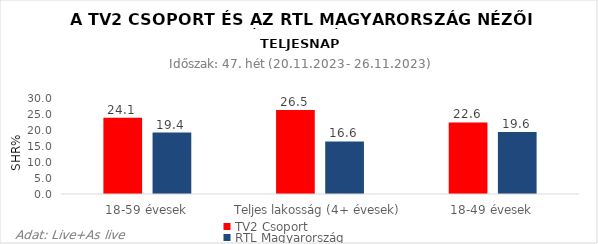
| Category | TV2 Csoport | RTL Magyarország |
|---|---|---|
| 18-59 évesek | 24.1 | 19.4 |
| Teljes lakosság (4+ évesek) | 26.5 | 16.6 |
| 18-49 évesek | 22.6 | 19.6 |